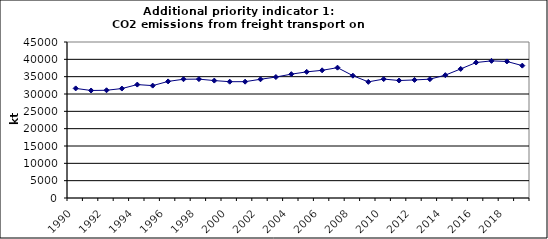
| Category | CO2 emissions from freight transport on road, kt  |
|---|---|
| 1990 | 31613.738 |
| 1991 | 31013.635 |
| 1992 | 31081.26 |
| 1993 | 31569.634 |
| 1994 | 32717.375 |
| 1995 | 32417.983 |
| 1996 | 33628.965 |
| 1997 | 34256.872 |
| 1998 | 34291.757 |
| 1999 | 33867.761 |
| 2000 | 33547.359 |
| 2001 | 33553.979 |
| 2002 | 34249.75 |
| 2003 | 34894.316 |
| 2004 | 35719.941 |
| 2005 | 36383.078 |
| 2006 | 36832.78 |
| 2007 | 37596.311 |
| 2008 | 35284.887 |
| 2009 | 33499.844 |
| 2010 | 34306.835 |
| 2011 | 33885.262 |
| 2012 | 34058.878 |
| 2013 | 34280.658 |
| 2014 | 35439.66 |
| 2015 | 37231.07 |
| 2016 | 39079.317 |
| 2017 | 39556.631 |
| 2018 | 39386.231 |
| 2019 | 38183.501 |